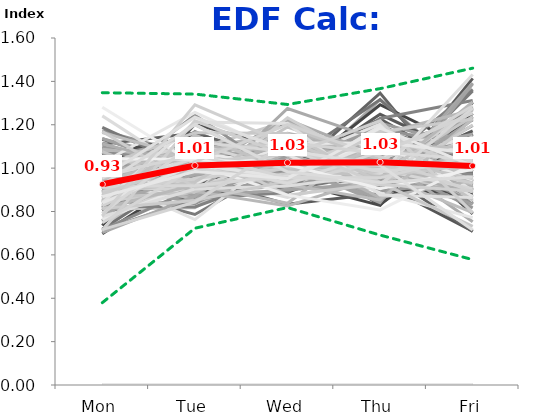
| Category | 1/2/06 | 1/9/06 | 1/16/06 | 1/23/06 | 1/30/06 | 2/6/06 | 2/13/06 | 2/20/06 | 2/27/06 | 3/6/06 | 3/13/06 | 3/20/06 | 3/27/06 | 4/3/06 | 4/10/06 | 4/17/06 | 4/24/06 | 5/1/06 | 5/8/06 | 5/15/06 | 5/22/06 | 5/29/06 | 6/5/06 | 6/12/06 | 6/19/06 | 6/26/06 | 7/3/06 | 7/10/06 | 7/17/06 | 7/24/06 | 7/31/06 | 8/7/06 | 8/14/06 | 8/21/06 | 8/28/06 | 9/4/06 | 9/11/06 | 9/18/06 | 9/25/06 | 10/2/06 | 10/9/06 | 10/16/06 | 10/23/06 | 10/30/06 | 11/6/06 | 11/13/06 | 11/20/06 | 11/27/06 | 12/4/06 | 12/11/06 | 12/18/06 | 12/25/06 | 1/1/07 | 1/8/07 | 1/15/07 | 1/22/07 | 1/29/07 | 2/5/07 | 2/12/07 | 2/19/07 | 2/26/07 | 3/5/07 | 3/12/07 | 3/19/07 | 3/26/07 | 4/2/07 | 4/9/07 | 4/16/07 | 4/23/07 | 4/30/07 | 5/7/07 | 5/14/07 | 5/21/07 | 5/28/07 | 6/4/07 | 6/11/07 | 6/18/07 | 6/25/07 | 7/2/07 | 7/9/07 | 7/16/07 | 7/23/07 | 7/30/07 | 8/6/07 | 8/13/07 | 8/20/07 | 8/27/07 | 9/3/07 | 9/10/07 | 9/17/07 | 9/24/07 | 10/1/07 | 10/8/07 | 10/15/07 | 10/22/07 | 10/29/07 | 11/5/07 | 11/12/07 | 11/19/07 | 11/26/07 | 12/3/07 | 12/10/07 | 12/17/07 | 12/24/07 | 12/31/07 | 1/7/08 | 1/14/08 | 1/21/08 | 1/28/08 | 2/4/08 | 2/11/08 | 2/18/08 | 2/25/08 | 3/3/08 | 3/10/08 | 3/17/08 | 3/24/08 | 3/31/08 | 4/7/08 | 4/14/08 | 4/21/08 | 4/28/08 | 5/5/08 | 5/12/08 | 5/19/08 | 5/26/08 | 6/2/08 | 6/9/08 | 6/16/08 | 6/23/08 | 6/30/08 | 7/7/08 | 7/14/08 | 7/21/08 | 7/28/08 | 8/4/08 | 8/11/08 | 8/18/08 | 8/25/08 | 9/1/08 | 9/8/08 | 9/15/08 | 9/22/08 | 9/29/08 | 10/6/08 | 10/13/08 | 10/20/08 | 10/27/08 | 11/3/08 | 11/10/08 | 11/17/08 | 11/24/08 | 12/1/08 | 12/8/08 | 12/15/08 | 12/22/08 | 12/29/08 | 1/5/09 | 1/12/09 | 1/19/09 | 1/26/09 | 2/2/09 | 2/9/09 | 2/16/09 | 2/23/09 | 3/2/09 | 3/9/09 | 3/16/09 | 3/23/09 | 3/30/09 | 4/6/09 | 4/13/09 | 4/20/09 | 4/27/09 | 5/4/09 | 5/11/09 | 5/18/09 | 5/25/09 | 6/1/09 | 6/8/09 | 6/15/09 | 6/22/09 | 6/29/09 | 7/6/09 | 7/13/09 | 7/20/09 | 7/27/09 | 8/3/09 | 8/10/09 | 8/17/09 | 8/24/09 | 8/31/09 | 9/7/09 | 9/14/09 | 9/21/09 | 9/28/09 | 10/5/09 | 10/12/09 | 10/19/09 | 10/26/09 | 11/2/09 | 11/9/09 | 11/16/09 | 11/23/09 | 11/30/09 | 12/7/09 | 12/14/09 | 12/21/09 | 12/28/09 | 1/4/10 | 1/11/10 | 1/18/10 | 1/25/10 | 2/1/10 | 2/8/10 | 2/15/10 | 2/22/10 | 3/1/10 | 3/8/10 | 3/15/10 | 3/22/10 | 3/29/10 | 4/5/10 | 4/12/10 | 4/19/10 | 4/26/10 | 5/3/10 | 5/10/10 | 5/17/10 | 5/24/10 | 5/31/10 | 6/7/10 | 6/14/10 | 6/21/10 | 6/28/10 | 7/5/10 | 7/12/10 | 7/19/10 | 7/26/10 | 8/2/10 | 8/9/10 | 8/16/10 | 8/23/10 | 8/30/10 | 9/6/10 | 9/13/10 | 9/20/10 | 9/27/10 | 10/4/10 | 10/11/10 | 10/18/10 | Min: | Max: | FINAL: |
|---|---|---|---|---|---|---|---|---|---|---|---|---|---|---|---|---|---|---|---|---|---|---|---|---|---|---|---|---|---|---|---|---|---|---|---|---|---|---|---|---|---|---|---|---|---|---|---|---|---|---|---|---|---|---|---|---|---|---|---|---|---|---|---|---|---|---|---|---|---|---|---|---|---|---|---|---|---|---|---|---|---|---|---|---|---|---|---|---|---|---|---|---|---|---|---|---|---|---|---|---|---|---|---|---|---|---|---|---|---|---|---|---|---|---|---|---|---|---|---|---|---|---|---|---|---|---|---|---|---|---|---|---|---|---|---|---|---|---|---|---|---|---|---|---|---|---|---|---|---|---|---|---|---|---|---|---|---|---|---|---|---|---|---|---|---|---|---|---|---|---|---|---|---|---|---|---|---|---|---|---|---|---|---|---|---|---|---|---|---|---|---|---|---|---|---|---|---|---|---|---|---|---|---|---|---|---|---|---|---|---|---|---|---|---|---|---|---|---|---|---|---|---|---|---|---|---|---|---|---|---|---|---|---|---|---|---|---|---|---|---|---|---|---|---|---|---|---|---|---|---|---|---|---|---|
| Mon | 0 | 1 | 0 | 0.877 | 0.905 | 0.878 | 0.84 | 0 | 0.89 | 1.019 | 0.92 | 0.953 | 0.882 | 1.077 | 0 | 0.757 | 0.849 | 0.992 | 0.918 | 0.955 | 1.133 | 0 | 0.861 | 0.816 | 1.015 | 0 | 0 | 0.806 | 0.853 | 0.916 | 0.96 | 0.89 | 0.933 | 0.969 | 0.929 | 0 | 0.93 | 0.977 | 1.066 | 0.861 | 0.842 | 0.912 | 0.929 | 0.883 | 0.942 | 0.87 | 0 | 0.91 | 1.047 | 0.833 | 1.109 | 0 | 0 | 0.98 | 0 | 0.928 | 0.969 | 0.941 | 0.954 | 0 | 0.735 | 1.172 | 0.805 | 0.941 | 0.964 | 0 | 0.889 | 0.939 | 0.902 | 1.01 | 0.894 | 0.91 | 0.98 | 0 | 0.898 | 0.822 | 0 | 1.011 | 0 | 0.921 | 0.839 | 0.697 | 0.925 | 0.947 | 0 | 1.137 | 0.848 | 0 | 1.017 | 0.71 | 1.059 | 1.136 | 0.719 | 0.895 | 0.965 | 0.812 | 0.881 | 1.052 | 0 | 0.902 | 1.02 | 0.792 | 0.918 | 0 | 0 | 0.909 | 0.716 | 0 | 0.91 | 0.852 | 0.977 | 0 | 0.968 | 0.936 | 0.904 | 0 | 1.093 | 1.066 | 1.017 | 0.924 | 0.86 | 0.892 | 0.905 | 0.891 | 0.943 | 0 | 0.881 | 0.949 | 0.824 | 0 | 0 | 0.937 | 0.817 | 0.829 | 0.864 | 0.921 | 1.099 | 0.964 | 0.976 | 0 | 1.068 | 0.849 | 1.037 | 1.241 | 0.901 | 0.966 | 0.846 | 0.902 | 0.874 | 0 | 0.714 | 0 | 1.009 | 1.188 | 0.779 | 0 | 0 | 1.083 | 0.864 | 0 | 0.94 | 0.873 | 0.917 | 0 | 0.878 | 1.055 | 0.887 | 0.954 | 1.116 | 0.95 | 0 | 0.921 | 0.993 | 0.973 | 0.917 | 0.949 | 0.976 | 0 | 1.087 | 0.972 | 0.86 | 0 | 0 | 0 | 0.997 | 0.97 | 0.827 | 0.848 | 1.016 | 1.072 | 1.039 | 1.025 | 0 | 0.761 | 0.846 | 0.702 | 1.011 | 0.764 | 0.861 | 0.909 | 1.165 | 1.112 | 1.076 | 0 | 1.017 | 0.999 | 0 | 0 | 0 | 0.871 | 0.938 | 0 | 0.862 | 0.814 | 0.908 | 0 | 0.856 | 0.957 | 0.827 | 0 | 0.894 | 0 | 0.882 | 0.777 | 1.169 | 0.844 | 0 | 1.28 | 0.814 | 0.841 | 0 | 1.011 | 0.914 | 0 | 0.712 | 0 | 0.748 | 0.881 | 0.913 | 1.043 | 0.827 | 0.839 | 0.79 | 0.779 | 0 | 0 | 0.969 | 0.868 | 0.924 | 0.716 | 0.955 | 0.38 | 1.348 | 0.925 |
| Tue | 0 | 1.03 | 0 | 1.006 | 1.073 | 1.034 | 1.122 | 0 | 1.096 | 1.006 | 0.934 | 1.071 | 0.98 | 0.968 | 0 | 1.089 | 0.953 | 0.995 | 0.926 | 0.877 | 1.013 | 0 | 0.994 | 1.169 | 0.999 | 0 | 0 | 1.014 | 0.993 | 1.017 | 0.985 | 1.06 | 1.006 | 1.049 | 1.085 | 0 | 0.999 | 0.973 | 1.062 | 1.011 | 1.007 | 0.969 | 1.03 | 1.079 | 1.001 | 1.051 | 0 | 0.904 | 1.047 | 0.971 | 1.162 | 0 | 0 | 1.079 | 0 | 1.042 | 0.974 | 0.959 | 1.038 | 0 | 1.202 | 1.057 | 1.086 | 0.965 | 0.905 | 0 | 0.93 | 0.957 | 1.07 | 1.08 | 1.014 | 1.066 | 0.988 | 0 | 0.942 | 1.021 | 0 | 1.076 | 0 | 1.09 | 0.901 | 0.972 | 1.01 | 0.909 | 0 | 0.982 | 1.127 | 0 | 1.029 | 1.097 | 1.012 | 1.027 | 0.999 | 0.941 | 0.885 | 0.817 | 0.861 | 1.02 | 0 | 1.03 | 1.002 | 1.085 | 0.952 | 0 | 0 | 0.978 | 0.906 | 0 | 0.876 | 1.098 | 1.059 | 0 | 0.994 | 1.075 | 1.093 | 0 | 1.019 | 1.146 | 0.97 | 0.94 | 1.012 | 0.922 | 1.034 | 1.035 | 1.011 | 0 | 0.997 | 1.047 | 0.821 | 0 | 0 | 1.05 | 1.101 | 1.088 | 1.067 | 1.098 | 1.003 | 1.047 | 0.991 | 0 | 1.066 | 0.996 | 0.992 | 0.965 | 0.786 | 1.089 | 0.835 | 1.116 | 1.069 | 0 | 0.858 | 0 | 1.028 | 0.992 | 1.015 | 0 | 0 | 1.072 | 0.869 | 0 | 0.872 | 0.901 | 1.245 | 0 | 0.989 | 0.965 | 1.2 | 0.763 | 0.963 | 1.004 | 0 | 1.075 | 1.029 | 0.903 | 0.842 | 1.057 | 0.992 | 0 | 1.043 | 0.931 | 0.895 | 0 | 0 | 0 | 0.851 | 1.048 | 0.972 | 0.888 | 1.101 | 0.872 | 1.006 | 1.257 | 0 | 0.953 | 1.009 | 0.87 | 1.078 | 0.928 | 0.995 | 0.901 | 1.044 | 1.006 | 0.915 | 0 | 0.893 | 1.113 | 0 | 0 | 0 | 1.072 | 1.059 | 0 | 0.89 | 0.924 | 1.09 | 0 | 0.994 | 1.073 | 1.071 | 0 | 0.952 | 0 | 0.936 | 0.903 | 0.912 | 1.151 | 0 | 1.019 | 0.85 | 1.213 | 0 | 1.164 | 0.92 | 0 | 1.218 | 0 | 1.002 | 1.026 | 1.044 | 1.04 | 1.029 | 1.016 | 1.121 | 1.292 | 0 | 0 | 1.06 | 0.984 | 1.201 | 0.844 | 1.235 | 0.723 | 1.341 | 1.012 |
| Wed | 0 | 1.038 | 0 | 1.007 | 1.059 | 1.039 | 1.079 | 0 | 0.991 | 1.057 | 0.995 | 0.992 | 1.02 | 1.012 | 0 | 1.049 | 1.01 | 1.018 | 0.961 | 1.078 | 1.212 | 0 | 0.965 | 0.988 | 1.097 | 0 | 0 | 0.929 | 1.075 | 1.049 | 1.011 | 1.132 | 1.087 | 1.038 | 1.023 | 0 | 0.939 | 1.049 | 1.055 | 1.125 | 1.077 | 1.037 | 1.092 | 1.098 | 1.049 | 1.045 | 0 | 0.913 | 1.017 | 0.915 | 1.031 | 0 | 0 | 0.964 | 0 | 0.995 | 1.094 | 0.979 | 1.093 | 0 | 1.087 | 0.989 | 1.156 | 1.118 | 1.076 | 0 | 1.116 | 0.955 | 1.054 | 1.029 | 1.037 | 0.99 | 1.07 | 0 | 0.976 | 0.995 | 0 | 1.04 | 0 | 1.006 | 1.101 | 0.954 | 1.158 | 1.027 | 0 | 1.07 | 1.018 | 0 | 1.016 | 1.077 | 1.014 | 0.993 | 1.027 | 1.012 | 1.089 | 1.069 | 0.963 | 0.978 | 0 | 1.079 | 1.079 | 1.217 | 0.833 | 0 | 0 | 1.079 | 1.053 | 0 | 1.004 | 1.013 | 1.01 | 0 | 0.951 | 0.967 | 0.888 | 0 | 0.985 | 1.003 | 0.986 | 1.109 | 1.046 | 1.15 | 1.075 | 1.025 | 1.159 | 0 | 1.004 | 1.052 | 0.977 | 0 | 0 | 0.905 | 1.033 | 1.161 | 1.099 | 0.978 | 1.062 | 1.113 | 0.971 | 0 | 0.963 | 0.961 | 0.906 | 0.865 | 1.027 | 0.911 | 1.047 | 1.087 | 1.063 | 0 | 0.887 | 0 | 1.001 | 0.901 | 0.907 | 0 | 0 | 0.985 | 0.965 | 0 | 1.141 | 0.968 | 0.957 | 0 | 0.998 | 1.003 | 0.989 | 1.096 | 1.078 | 0.947 | 0 | 0.915 | 1.049 | 1.028 | 1.057 | 1.13 | 1.223 | 0 | 0.945 | 1.113 | 1.016 | 0 | 0 | 0 | 1.107 | 0.939 | 0.973 | 1.232 | 1.076 | 0.9 | 0.957 | 1.061 | 0 | 1.029 | 1.083 | 1.275 | 0.927 | 1.115 | 1.11 | 1.082 | 1.031 | 1 | 1.002 | 0 | 0.826 | 0.989 | 0 | 0 | 0 | 1.012 | 0.923 | 0 | 1.034 | 0.838 | 0.875 | 0 | 0.959 | 0.95 | 1.124 | 0 | 0.999 | 0 | 1.19 | 0.917 | 0.975 | 0.992 | 0 | 0.875 | 0.941 | 1.206 | 0 | 1.16 | 0.965 | 0 | 1.057 | 0 | 0.932 | 1.065 | 0.929 | 1.017 | 1.201 | 0.958 | 1.076 | 1.109 | 0 | 0 | 0.956 | 0.952 | 0.983 | 1.119 | 1.083 | 0.818 | 1.294 | 1.025 |
| Thu | 0 | 1.026 | 0 | 1.088 | 1.035 | 1.037 | 1.027 | 0 | 1.075 | 0.948 | 0.979 | 0.974 | 1.04 | 0.997 | 0 | 1.065 | 1.166 | 1.005 | 1.094 | 0.954 | 0.931 | 0 | 1.346 | 1.012 | 0.973 | 0 | 0 | 1.149 | 0.976 | 1.039 | 1.051 | 1.044 | 1.078 | 1.051 | 1.074 | 0 | 0.828 | 1.08 | 0.929 | 1.053 | 1.051 | 1.049 | 1.034 | 1.031 | 1.141 | 1.022 | 0 | 1.315 | 0.974 | 0.999 | 0.989 | 0 | 0 | 1.03 | 0 | 1.111 | 1.067 | 1.039 | 0.971 | 0 | 1.074 | 0.938 | 0.837 | 1.073 | 1.001 | 0 | 1.071 | 0.996 | 1.049 | 0.966 | 1.106 | 0.994 | 1.173 | 0 | 1.202 | 0.909 | 0 | 0.91 | 0 | 1.101 | 0.962 | 1.292 | 0.915 | 1.12 | 0 | 0.977 | 0.973 | 0 | 0.993 | 0.844 | 0.912 | 0.867 | 1.316 | 0.915 | 1.099 | 1.162 | 1.248 | 0.925 | 0 | 0.831 | 1.009 | 0.996 | 0.883 | 0 | 0 | 1.095 | 1.104 | 0 | 1.226 | 1.103 | 0.967 | 0 | 0.948 | 0.985 | 1.044 | 0 | 0.982 | 0.899 | 1.02 | 0.947 | 1.115 | 1.068 | 1.034 | 1.008 | 0.992 | 0 | 0.992 | 1.034 | 1.014 | 0 | 0 | 0.984 | 1.148 | 1.08 | 1.063 | 1.031 | 0.893 | 0.976 | 1.069 | 0 | 0.999 | 1.095 | 1.041 | 0.967 | 0.93 | 1.122 | 1.186 | 0.917 | 1.099 | 0 | 1.229 | 0 | 0.946 | 0.975 | 0.907 | 0 | 0 | 0.965 | 1.207 | 0 | 0.991 | 1.134 | 1.037 | 0 | 0.859 | 1.006 | 1.014 | 1.048 | 1.027 | 1.171 | 0 | 0.975 | 0.925 | 1.203 | 1.132 | 0.969 | 1.055 | 0 | 0.978 | 1.116 | 0.841 | 0 | 0 | 0 | 0.989 | 1.193 | 1.072 | 0.995 | 0.864 | 0.934 | 1.001 | 0.886 | 0 | 0.989 | 1.127 | 1.129 | 1.131 | 1.114 | 1.037 | 0.962 | 0.966 | 0.99 | 1.018 | 0 | 0.96 | 0.993 | 0 | 0 | 0 | 1.099 | 0.853 | 0 | 0.975 | 1.156 | 0.928 | 0 | 1.091 | 0.995 | 0.962 | 0 | 1.158 | 0 | 1.041 | 0.971 | 1.013 | 0.962 | 0 | 0.807 | 1.168 | 0.876 | 0 | 0.935 | 0.924 | 0 | 1.218 | 0 | 1.029 | 1.029 | 1.077 | 0.905 | 1.053 | 1.121 | 0.983 | 0.924 | 0 | 0 | 0.955 | 1.184 | 0.933 | 1.068 | 1.013 | 0.691 | 1.366 | 1.027 |
| Fri | 0 | 0.907 | 0 | 1.021 | 0.929 | 1.013 | 0.933 | 0 | 0.948 | 0.969 | 1.172 | 1.01 | 1.078 | 0.946 | 0 | 1.039 | 1.022 | 0.989 | 1.101 | 1.136 | 0.71 | 0 | 0.835 | 1.015 | 0.916 | 0 | 0 | 1.102 | 1.103 | 0.98 | 0.993 | 0.874 | 0.897 | 0.894 | 0.889 | 0 | 1.304 | 0.92 | 0.888 | 0.95 | 1.023 | 1.033 | 0.915 | 0.908 | 0.867 | 1.011 | 0 | 0.957 | 0.916 | 1.282 | 0.708 | 0 | 0 | 0.947 | 0 | 0.924 | 0.896 | 1.082 | 0.943 | 0 | 0.902 | 0.844 | 1.116 | 0.903 | 1.054 | 0 | 0.994 | 1.154 | 0.925 | 0.915 | 0.949 | 1.04 | 0.789 | 0 | 0.982 | 1.253 | 0 | 0.964 | 0 | 0.882 | 1.197 | 1.084 | 0.993 | 0.997 | 0 | 0.834 | 1.035 | 0 | 0.944 | 1.271 | 1.004 | 0.978 | 0.94 | 1.237 | 0.963 | 1.14 | 1.047 | 1.026 | 0 | 1.157 | 0.889 | 0.91 | 1.414 | 0 | 0 | 0.938 | 1.221 | 0 | 0.984 | 0.934 | 0.987 | 0 | 1.139 | 1.037 | 1.072 | 0 | 0.92 | 0.886 | 1.008 | 1.08 | 0.966 | 0.969 | 0.952 | 1.04 | 0.895 | 0 | 1.125 | 0.917 | 1.363 | 0 | 0 | 1.123 | 0.901 | 0.842 | 0.908 | 0.972 | 0.942 | 0.901 | 0.993 | 0 | 0.905 | 1.098 | 1.023 | 0.963 | 1.356 | 0.912 | 1.085 | 0.979 | 0.895 | 0 | 1.312 | 0 | 1.016 | 0.944 | 1.392 | 0 | 0 | 0.895 | 1.095 | 0 | 1.055 | 1.124 | 0.845 | 0 | 1.276 | 0.972 | 0.911 | 1.14 | 0.817 | 0.927 | 0 | 1.114 | 1.004 | 0.893 | 1.051 | 0.895 | 0.753 | 0 | 0.947 | 0.868 | 1.389 | 0 | 0 | 0 | 1.056 | 0.849 | 1.156 | 1.036 | 0.943 | 1.223 | 0.997 | 0.772 | 0 | 1.268 | 0.935 | 1.023 | 0.853 | 1.078 | 0.997 | 1.145 | 0.795 | 0.891 | 0.989 | 0 | 1.305 | 0.906 | 0 | 0 | 0 | 0.945 | 1.227 | 0 | 1.238 | 1.268 | 1.199 | 0 | 1.1 | 1.024 | 1.017 | 0 | 0.997 | 0 | 0.951 | 1.431 | 0.932 | 1.05 | 0 | 1.018 | 1.227 | 0.865 | 0 | 0.731 | 1.277 | 0 | 0.795 | 0 | 1.288 | 1 | 1.037 | 0.994 | 0.89 | 1.066 | 1.029 | 0.895 | 0 | 0 | 1.059 | 1.012 | 0.959 | 1.254 | 0.714 | 0.578 | 1.461 | 1.01 |